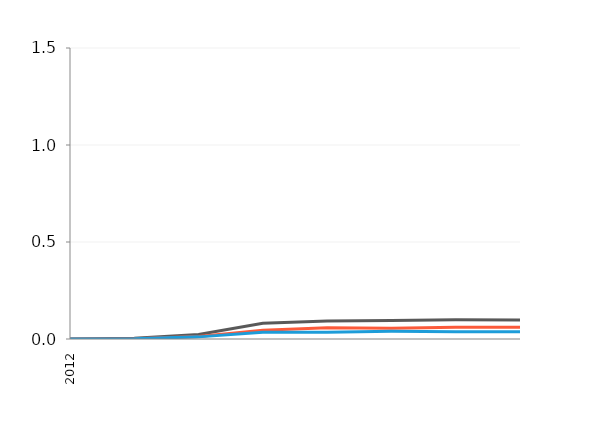
| Category | All smart meters | Electricity smart meters | Gas smart meters |
|---|---|---|---|
| 2012.0 | 68 | 36 | 32 |
| 2013.0 | 3241 | 1671 | 1570 |
| 2014.0 | 23641 | 12678 | 10963 |
| 2015.0 | 80586 | 45456 | 35130 |
| 2016.0 | 92822 | 57632 | 35190 |
| 2017.0 | 95333 | 55603 | 39730 |
| 2018.0 | 98644 | 61164 | 37480 |
| 2019.0 | 97329 | 60216 | 37113 |